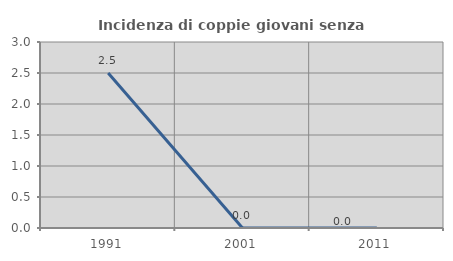
| Category | Incidenza di coppie giovani senza figli |
|---|---|
| 1991.0 | 2.5 |
| 2001.0 | 0 |
| 2011.0 | 0 |